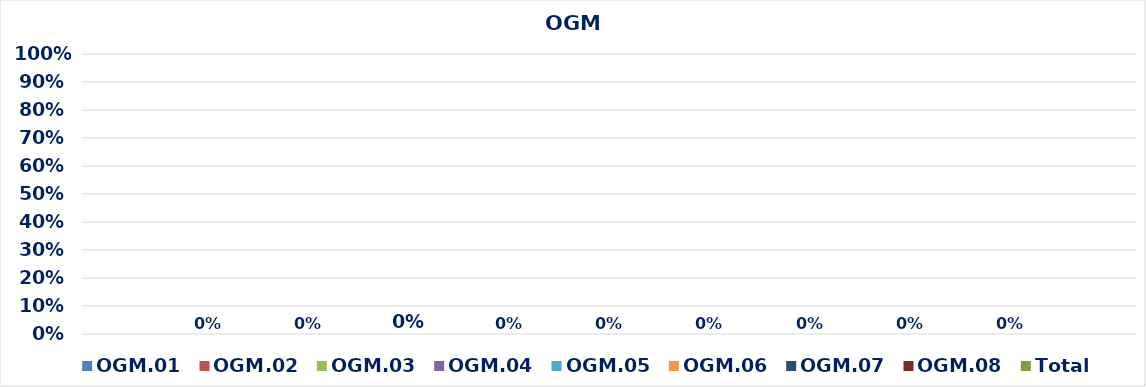
| Category | OGM.01 | OGM.02 | OGM.03 | OGM.04 | OGM.05 | OGM.06 | OGM.07 | OGM.08 | Total |
|---|---|---|---|---|---|---|---|---|---|
| 0 | 0 | 0 | 0 | 0 | 0 | 0 | 0 | 0 | 0 |